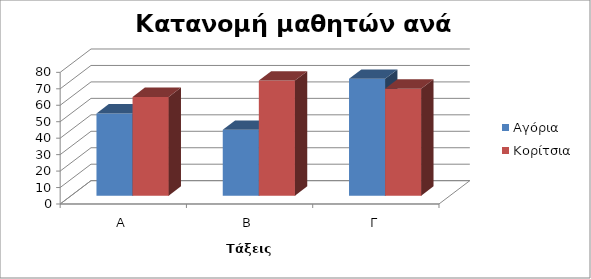
| Category | Αγόρια | Κορίτσια |
|---|---|---|
| Α | 50 | 60 |
| Β | 40 | 70 |
| Γ | 71 | 65 |